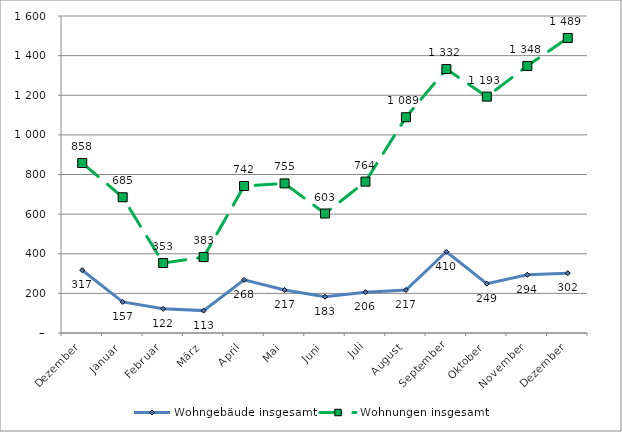
| Category | Wohngebäude insgesamt | Wohnungen insgesamt |
|---|---|---|
| Dezember | 317 | 858 |
| Januar | 157 | 685 |
| Februar | 122 | 353 |
| März | 113 | 383 |
| April | 268 | 742 |
| Mai | 217 | 755 |
| Juni | 183 | 603 |
| Juli | 206 | 764 |
| August | 217 | 1089 |
| September | 410 | 1332 |
| Oktober | 249 | 1193 |
| November | 294 | 1348 |
| Dezember | 302 | 1489 |